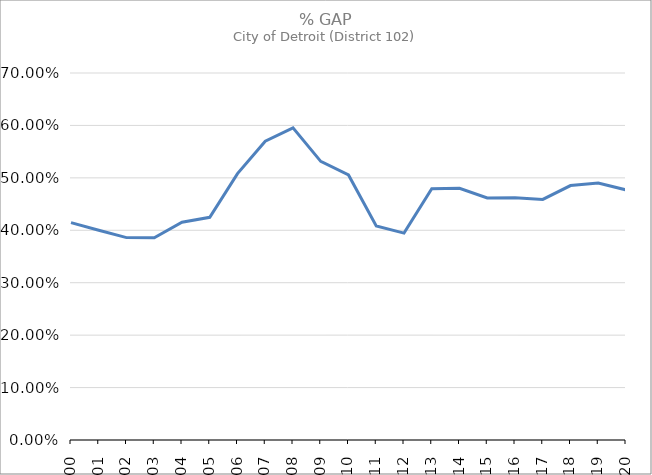
| Category | Series 0 |
|---|---|
| 2000.0 | 0.415 |
| 2001.0 | 0.4 |
| 2002.0 | 0.386 |
| 2003.0 | 0.386 |
| 2004.0 | 0.415 |
| 2005.0 | 0.425 |
| 2006.0 | 0.508 |
| 2007.0 | 0.57 |
| 2008.0 | 0.595 |
| 2009.0 | 0.531 |
| 2010.0 | 0.506 |
| 2011.0 | 0.408 |
| 2012.0 | 0.395 |
| 2013.0 | 0.479 |
| 2014.0 | 0.48 |
| 2015.0 | 0.462 |
| 2016.0 | 0.462 |
| 2017.0 | 0.459 |
| 2018.0 | 0.485 |
| 2019.0 | 0.49 |
| 2020.0 | 0.477 |